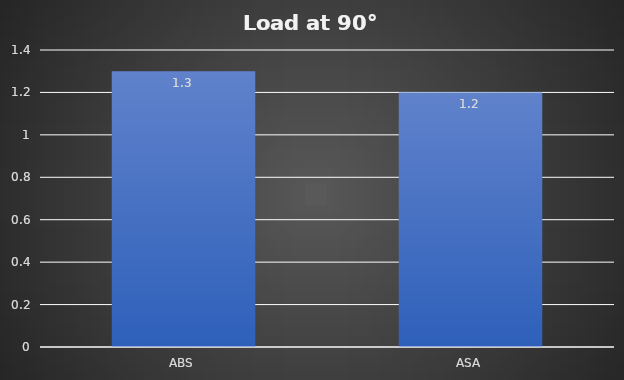
| Category | Load at 90° |
|---|---|
| ABS | 1.3 |
| ASA | 1.2 |